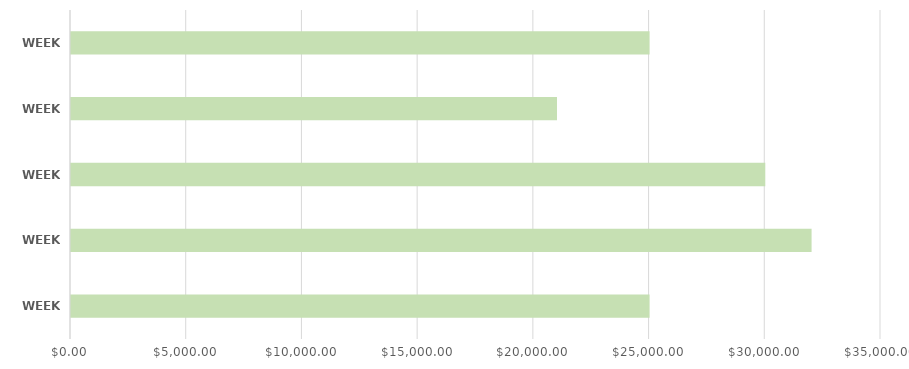
| Category | Series 0 |
|---|---|
| WEEK 1 | 25000 |
| WEEK 2 | 32000 |
| WEEK 3 | 30000 |
| WEEK 4 | 21000 |
| WEEK 5 | 25000 |